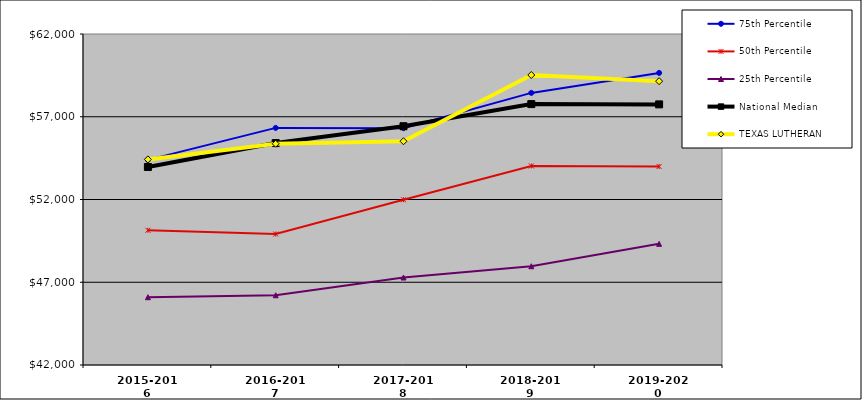
| Category | 75th Percentile | 50th Percentile | 25th Percentile | National Median | TEXAS LUTHERAN |
|---|---|---|---|---|---|
| 2015-2016 | 54393.75 | 50139 | 46095.75 | 53964 | 54423 |
| 2016-2017 | 56326 | 49914 | 46214.25 | 55410 | 55368 |
| 2017-2018 | 56311 | 51986.5 | 47286.5 | 56428 | 55522 |
| 2018-2019 | 58441.75 | 54026.5 | 47967.25 | 57764 | 59522 |
| 2019-2020 | 59648.5 | 53995.5 | 49321.25 | 57747 | 59150 |